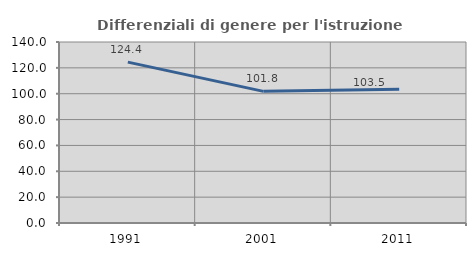
| Category | Differenziali di genere per l'istruzione superiore |
|---|---|
| 1991.0 | 124.412 |
| 2001.0 | 101.818 |
| 2011.0 | 103.496 |